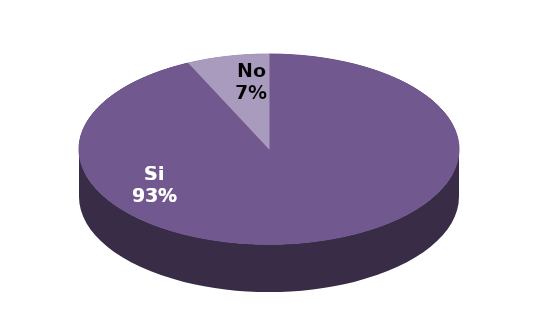
| Category | Series 1 |
|---|---|
| Si | 173 |
| No | 13 |